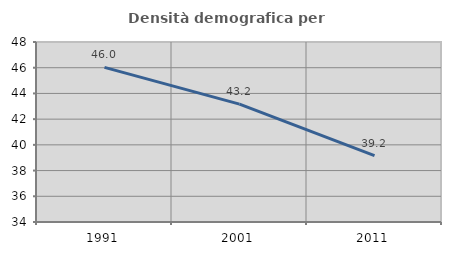
| Category | Densità demografica |
|---|---|
| 1991.0 | 46.024 |
| 2001.0 | 43.17 |
| 2011.0 | 39.159 |